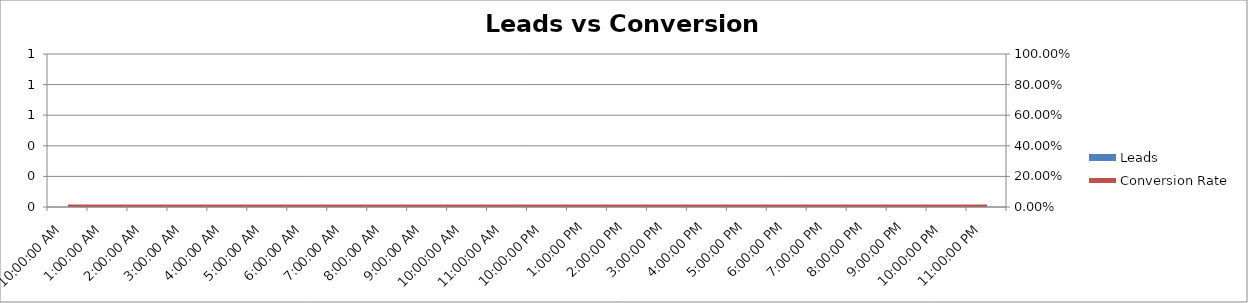
| Category | Leads |
|---|---|
| 0.0 | 0 |
| 0.0416666666666667 | 0 |
| 0.0833333333333333 | 0 |
| 0.125 | 0 |
| 0.166666666666667 | 0 |
| 0.208333333333333 | 0 |
| 0.25 | 0 |
| 0.291666666666667 | 0 |
| 0.333333333333333 | 0 |
| 0.375 | 0 |
| 0.416666666666667 | 0 |
| 0.458333333333333 | 0 |
| 0.5 | 0 |
| 0.541666666666667 | 0 |
| 0.583333333333333 | 0 |
| 0.625 | 0 |
| 0.666666666666667 | 0 |
| 0.708333333333333 | 0 |
| 0.75 | 0 |
| 0.791666666666667 | 0 |
| 0.833333333333333 | 0 |
| 0.875 | 0 |
| 0.916666666666667 | 0 |
| 0.958333333333333 | 0 |